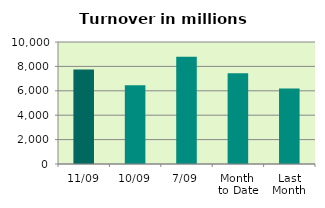
| Category | Series 0 |
|---|---|
| 11/09 | 7747.996 |
| 10/09 | 6445.948 |
| 7/09 | 8796.022 |
| Month 
to Date | 7439.556 |
| Last
Month | 6185.877 |